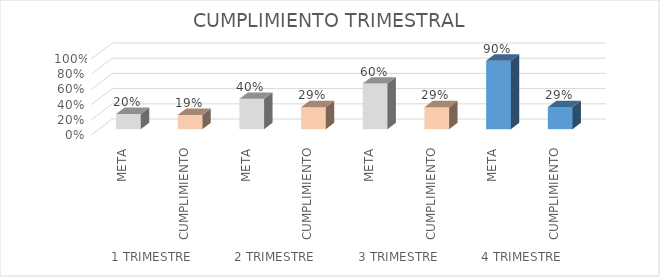
| Category | Series 0 |
|---|---|
| 0 | 0.2 |
| 1 | 0.188 |
| 2 | 0.4 |
| 3 | 0.29 |
| 4 | 0.6 |
| 5 | 0.29 |
| 6 | 0.9 |
| 7 | 0.29 |